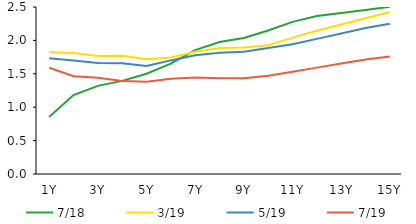
| Category | 7/18 | 3/19 | 5/19 | 7/19 |
|---|---|---|---|---|
|  1Y | 0.853 | 1.821 | 1.731 | 1.591 |
|  2Y | 1.182 | 1.811 | 1.697 | 1.464 |
|  3Y | 1.319 | 1.766 | 1.662 | 1.441 |
|  4Y | 1.394 | 1.771 | 1.658 | 1.391 |
|  5Y | 1.5 | 1.718 | 1.616 | 1.38 |
|  6Y | 1.651 | 1.744 | 1.701 | 1.425 |
|  7Y | 1.855 | 1.829 | 1.777 | 1.444 |
|  8Y | 1.975 | 1.886 | 1.814 | 1.435 |
|  9Y | 2.036 | 1.895 | 1.829 | 1.432 |
|  10Y | 2.149 | 1.926 | 1.886 | 1.472 |
|  11Y | 2.277 | 2.041 | 1.942 | 1.531 |
|  12Y | 2.364 | 2.145 | 2.023 | 1.592 |
|  13Y | 2.41 | 2.238 | 2.104 | 1.653 |
|  14Y | 2.456 | 2.331 | 2.185 | 1.714 |
|  15Y | 2.502 | 2.425 | 2.25 | 1.758 |